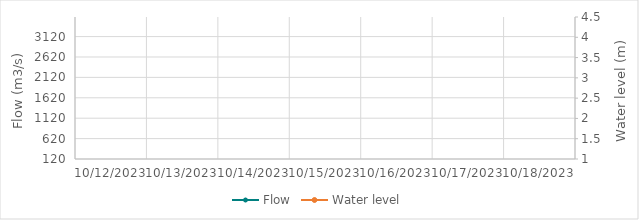
| Category | Flow |
|---|---|
| 5/11/23 | 1091.2 |
| 5/10/23 | 1086.3 |
| 5/9/23 | 1134 |
| 5/8/23 | 1045.72 |
| 5/7/23 | 928.48 |
| 5/6/23 | 812.3 |
| 5/5/23 | 772.59 |